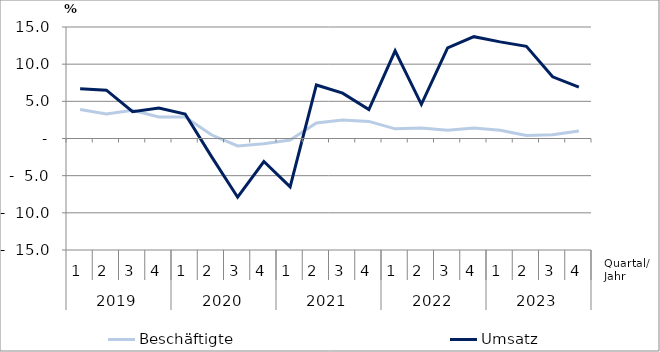
| Category | Beschäftigte | Umsatz |
|---|---|---|
| 0 | 3.9 | 6.7 |
| 1 | 3.3 | 6.5 |
| 2 | 3.8 | 3.6 |
| 3 | 2.9 | 4.1 |
| 4 | 2.9 | 3.3 |
| 5 | 0.5 | -2.4 |
| 6 | -1 | -7.9 |
| 7 | -0.7 | -3.1 |
| 8 | -0.2 | -6.5 |
| 9 | 2.1 | 7.2 |
| 10 | 2.5 | 6.1 |
| 11 | 2.3 | 3.9 |
| 12 | 1.3 | 11.8 |
| 13 | 1.4 | 4.6 |
| 14 | 1.1 | 12.2 |
| 15 | 1.4 | 13.7 |
| 16 | 1.1 | 13 |
| 17 | 0.4 | 12.4 |
| 18 | 0.5 | 8.3 |
| 19 | 1 | 6.9 |